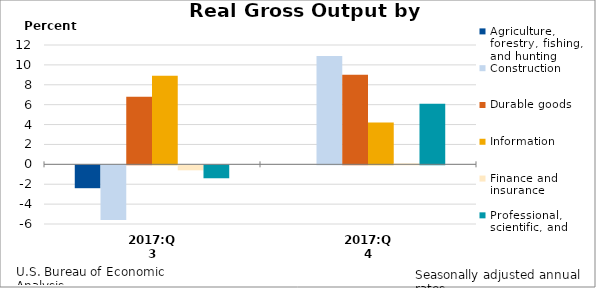
| Category | Agriculture, forestry, fishing, and hunting | Construction | Durable goods | Information | Finance and insurance | Professional, scientific, and technical services |
|---|---|---|---|---|---|---|
| 2017:Q3 | -2.3 | -5.5 | 6.8 | 8.9 | -0.5 | -1.3 |
| 2017:Q4 | 0 | 10.9 | 9 | 4.2 | 0.1 | 6.1 |